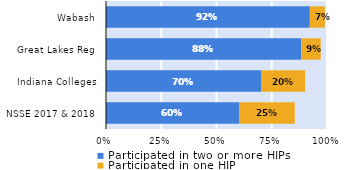
| Category | Participated in two or more HIPs | Participated in one HIP |
|---|---|---|
| NSSE 2017 & 2018 | 0.604 | 0.25 |
| Indiana Colleges | 0.701 | 0.2 |
| Great Lakes Reg | 0.883 | 0.089 |
| Wabash | 0.922 | 0.068 |